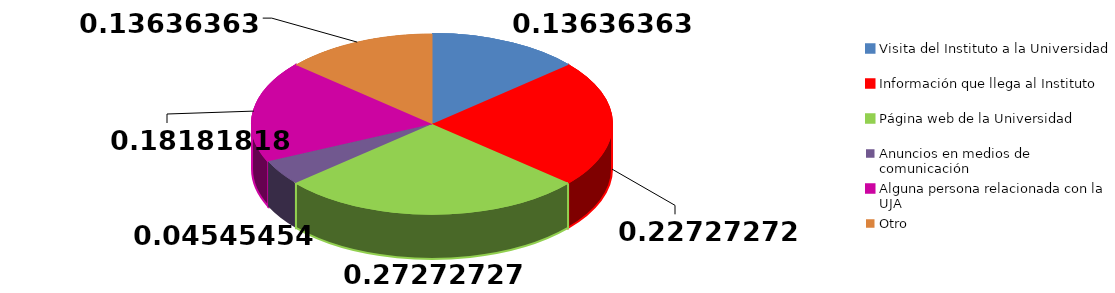
| Category | Frecuencia | Series 1 |
|---|---|---|
| Visita del Instituto a la Universidad | 3 |  |
| Información que llega al Instituto | 5 |  |
| Página web de la Universidad | 6 |  |
| Anuncios en medios de comunicación | 1 |  |
| Alguna persona relacionada con la UJA | 4 |  |
| Otro | 3 |  |